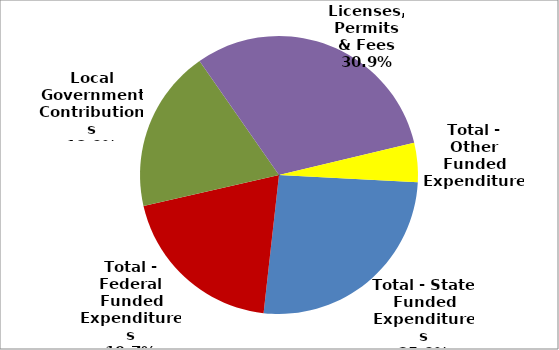
| Category | Series 0 |
|---|---|
| Total - State Funded Expenditures | 4033154 |
| Total - Federal Funded Expenditures | 3055696 |
| Local Government Contributions | 2936843 |
| Licenses, Permits & Fees | 4811895 |
| Total - Other Funded Expenditures | 710834 |